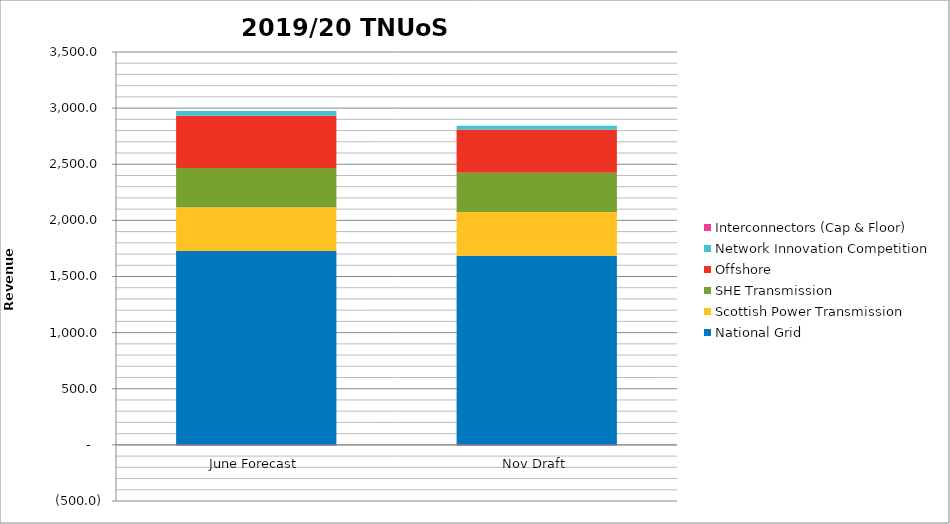
| Category | National Grid | Scottish Power Transmission | SHE Transmission | Offshore | Network Innovation Competition | Interconnectors (Cap & Floor) |
|---|---|---|---|---|---|---|
| June Forecast | 1726.637 | 389.976 | 349.387 | 466.662 | 42.5 | -6.8 |
| Nov Draft | 1684.12 | 389.976 | 349.387 | 386.479 | 32.664 | -6.8 |